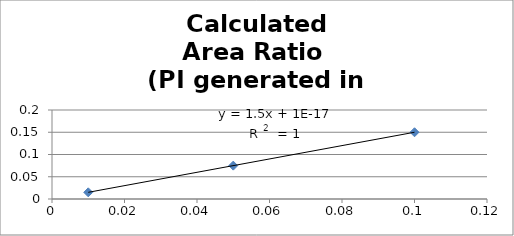
| Category | Calculated
Area Ratio 
(PI generated in injector) |
|---|---|
| 0.01 | 0.015 |
| 0.05 | 0.075 |
| 0.1 | 0.15 |